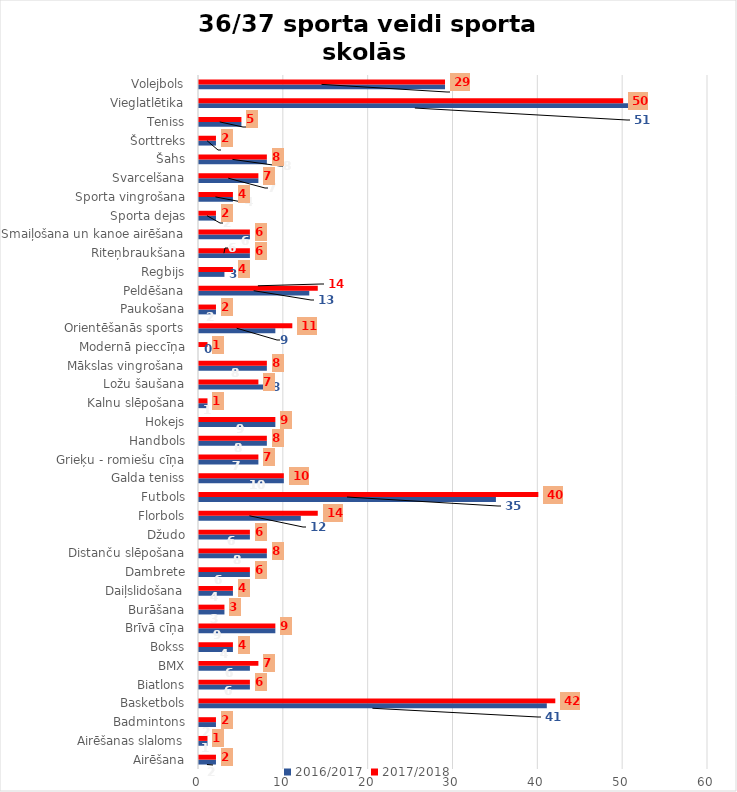
| Category | 2016/2017 | 2017/2018 |
|---|---|---|
| Airēšana | 2 | 2 |
| Airēšanas slaloms | 1 | 1 |
| Badmintons | 2 | 2 |
| Basketbols | 41 | 42 |
| Biatlons | 6 | 6 |
| BMX | 6 | 7 |
| Bokss | 4 | 4 |
| Brīvā cīņa | 9 | 9 |
| Burāšana | 3 | 3 |
| Daiļslidošana | 4 | 4 |
| Dambrete | 6 | 6 |
| Distanču slēpošana | 8 | 8 |
| Džudo | 6 | 6 |
| Florbols | 12 | 14 |
| Futbols | 35 | 40 |
| Galda teniss | 10 | 10 |
| Grieķu - romiešu cīņa | 7 | 7 |
| Handbols | 8 | 8 |
| Hokejs | 9 | 9 |
| Kalnu slēpošana | 1 | 1 |
| Ložu šaušana | 8 | 7 |
| Mākslas vingrošana | 8 | 8 |
| Modernā pieccīņa | 0 | 1 |
| Orientēšanās sports | 9 | 11 |
| Paukošana | 2 | 2 |
| Peldēšana | 13 | 14 |
| Regbijs | 3 | 4 |
| Riteņbraukšana | 6 | 6 |
| Smaiļošana un kanoe airēšana | 6 | 6 |
| Sporta dejas | 2 | 2 |
| Sporta vingrošana | 4 | 4 |
| Svarcelšana | 7 | 7 |
| Šahs | 8 | 8 |
| Šorttreks | 2 | 2 |
| Teniss | 5 | 5 |
| Vieglatlētika | 51 | 50 |
| Volejbols | 29 | 29 |